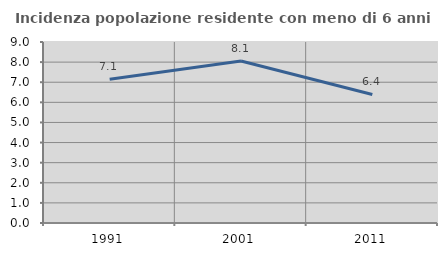
| Category | Incidenza popolazione residente con meno di 6 anni |
|---|---|
| 1991.0 | 7.148 |
| 2001.0 | 8.053 |
| 2011.0 | 6.39 |